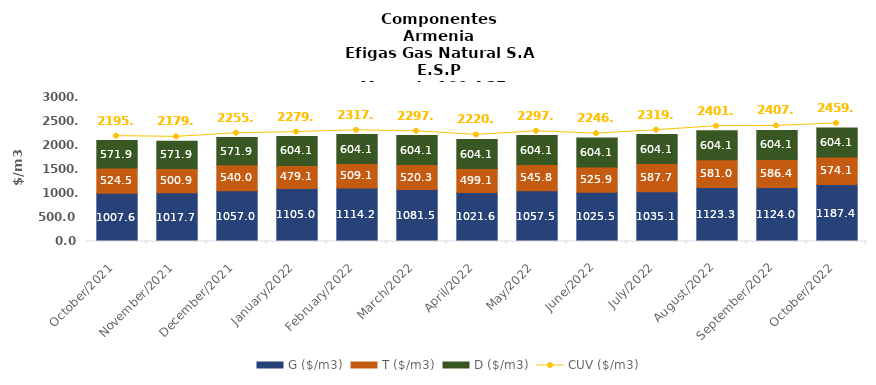
| Category | G ($/m3) | T ($/m3) | D ($/m3) |
|---|---|---|---|
| 2021-10-01 | 1007.56 | 524.5 | 571.94 |
| 2021-11-01 | 1017.67 | 500.87 | 571.94 |
| 2021-12-01 | 1057.02 | 540.03 | 571.94 |
| 2022-01-01 | 1104.95 | 479.06 | 604.09 |
| 2022-02-01 | 1114.19 | 509.07 | 604.09 |
| 2022-03-01 | 1081.46 | 520.29 | 604.09 |
| 2022-04-01 | 1021.55 | 499.13 | 604.09 |
| 2022-05-01 | 1057.51 | 545.79 | 604.09 |
| 2022-06-01 | 1025.45 | 525.86 | 604.09 |
| 2022-07-01 | 1035.13 | 587.69 | 604.09 |
| 2022-08-01 | 1123.29 | 581.03 | 604.09 |
| 2022-09-01 | 1123.97 | 586.38 | 604.09 |
| 2022-10-01 | 1187.44 | 574.12 | 604.09 |